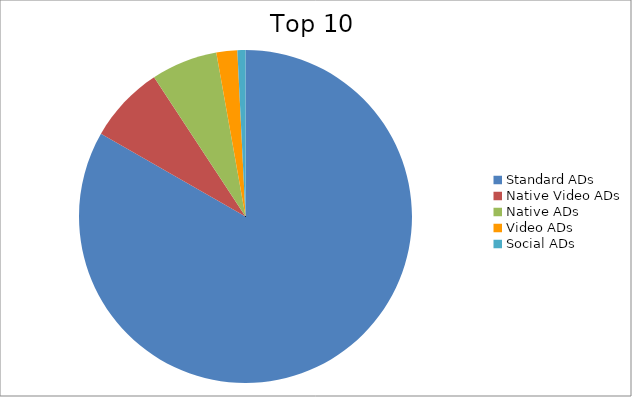
| Category | Series 0 |
|---|---|
| Standard ADs | 83.27 |
| Native Video ADs | 7.48 |
| Native ADs | 6.44 |
| Video ADs | 2.03 |
| Social ADs | 0.78 |